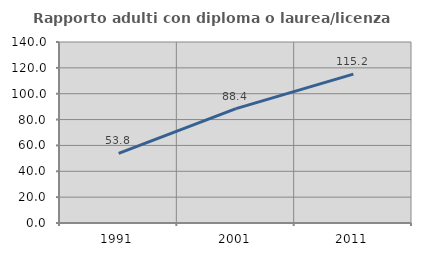
| Category | Rapporto adulti con diploma o laurea/licenza media  |
|---|---|
| 1991.0 | 53.846 |
| 2001.0 | 88.433 |
| 2011.0 | 115.194 |